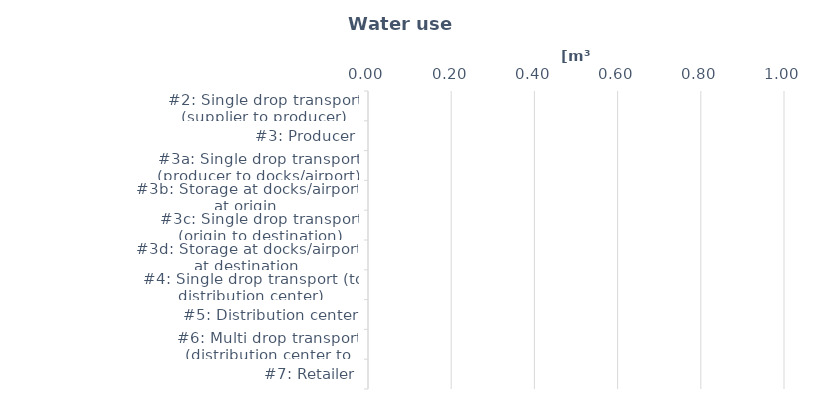
| Category | Water |
|---|---|
| #2: Single drop transport (supplier to producer) | 0 |
| #3: Producer | 0 |
| #3a: Single drop transport (producer to docks/airport) | 0 |
| #3b: Storage at docks/airport at origin | 0 |
| #3c: Single drop transport (origin to destination) | 0 |
| #3d: Storage at docks/airport at destination | 0 |
| #4: Single drop transport (to distribution center) | 0 |
| #5: Distribution center | 0 |
| #6: Multi drop transport (distribution center to retailer) | 0 |
| #7: Retailer | 0 |